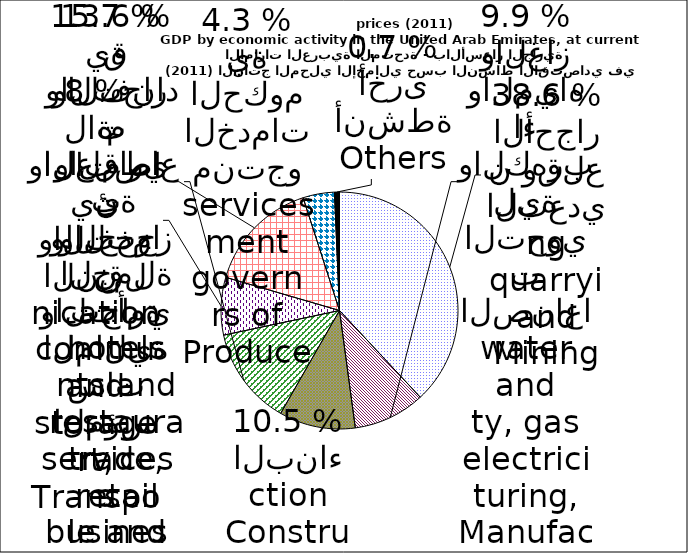
| Category | Series 0 |
|---|---|
| Mining and quarrying | 479981.592 |
| Manufacturing, electricity, gas and water | 123640.622 |
| Construction | 131209.901 |
| Wholesale and retail trade, restaurants and hotels | 168874 |
| Transport, storage and communication | 99007.048 |
| Financial institutions, insurrance, real estate and business services | 195664.207 |
| Producers of government services | 54058.851 |
| Others | -8597.361 |